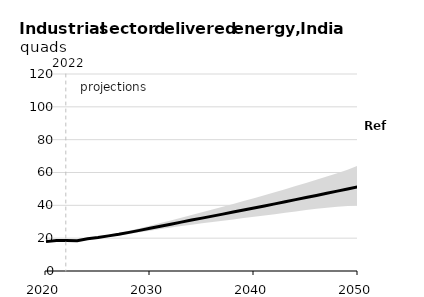
| Category | Ref |
|---|---|
| 0 | 17.89 |
| 1 | 18.548 |
| 2 | 18.62 |
| 3 | 18.497 |
| 4 | 19.677 |
| 5 | 20.461 |
| 6 | 21.4 |
| 7 | 22.367 |
| 8 | 23.522 |
| 9 | 24.735 |
| 10 | 25.994 |
| 11 | 27.252 |
| 12 | 28.516 |
| 13 | 29.777 |
| 14 | 31.007 |
| 15 | 32.224 |
| 16 | 33.437 |
| 17 | 34.657 |
| 18 | 35.894 |
| 19 | 37.147 |
| 20 | 38.38 |
| 21 | 39.638 |
| 22 | 40.896 |
| 23 | 42.174 |
| 24 | 43.46 |
| 25 | 44.754 |
| 26 | 46.046 |
| 27 | 47.348 |
| 28 | 48.648 |
| 29 | 49.95 |
| 30 | 51.264 |